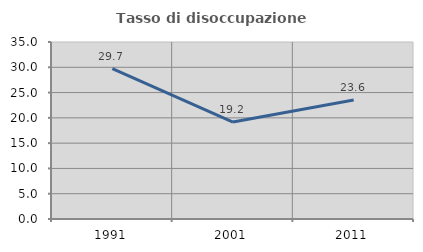
| Category | Tasso di disoccupazione giovanile  |
|---|---|
| 1991.0 | 29.742 |
| 2001.0 | 19.164 |
| 2011.0 | 23.551 |